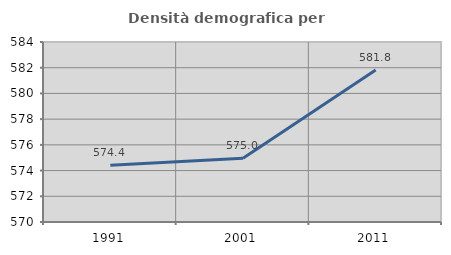
| Category | Densità demografica |
|---|---|
| 1991.0 | 574.416 |
| 2001.0 | 574.95 |
| 2011.0 | 581.813 |